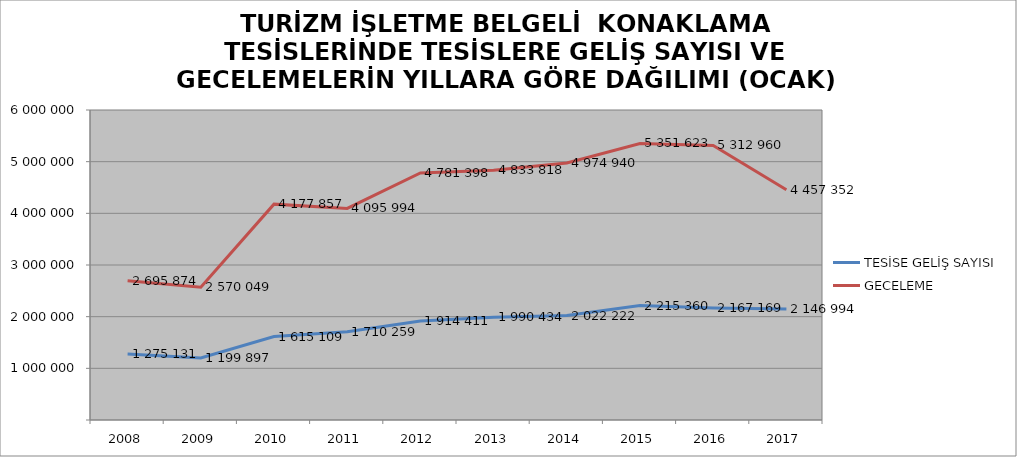
| Category | TESİSE GELİŞ SAYISI | GECELEME |
|---|---|---|
| 2008 | 1275131 | 2695874 |
| 2009 | 1199897 | 2570049 |
| 2010 | 1615109 | 4177857 |
| 2011 | 1710259 | 4095994 |
| 2012 | 1914411 | 4781398 |
| 2013 | 1990434 | 4833818 |
| 2014 | 2022222 | 4974940 |
| 2015 | 2215360 | 5351623 |
| 2016 | 2167169 | 5312960 |
| 2017 | 2146994 | 4457352 |